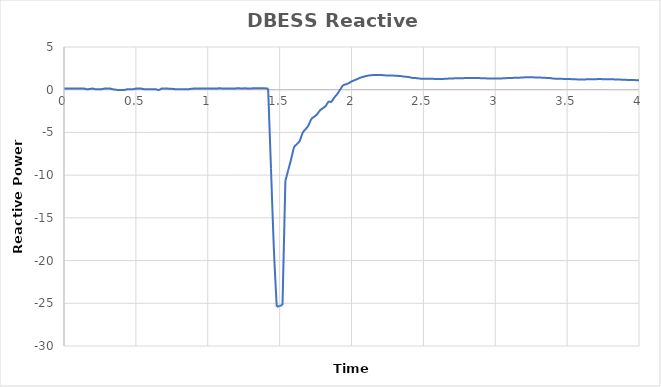
| Category | DBESS Reactive Power |
|---|---|
| 0.0 | 0.132 |
| 0.02 | 0.139 |
| 0.04 | 0.136 |
| 0.06 | 0.136 |
| 0.08 | 0.136 |
| 0.1 | 0.128 |
| 0.12 | 0.13 |
| 0.14 | 0.133 |
| 0.16 | 0.052 |
| 0.18 | 0.092 |
| 0.2 | 0.132 |
| 0.22 | 0.051 |
| 0.24 | 0.055 |
| 0.26 | 0.059 |
| 0.28 | 0.127 |
| 0.3 | 0.134 |
| 0.32 | 0.14 |
| 0.34 | 0.051 |
| 0.36 | 0.006 |
| 0.38 | -0.039 |
| 0.4 | -0.037 |
| 0.42 | -0.035 |
| 0.44 | 0.057 |
| 0.46 | 0.058 |
| 0.48 | 0.058 |
| 0.5 | 0.131 |
| 0.52 | 0.129 |
| 0.54 | 0.126 |
| 0.56 | 0.05 |
| 0.58 | 0.046 |
| 0.6 | 0.042 |
| 0.62 | 0.051 |
| 0.64 | 0.051 |
| 0.66 | -0.033 |
| 0.68 | 0.132 |
| 0.7 | 0.13 |
| 0.72 | 0.129 |
| 0.74 | 0.122 |
| 0.76 | 0.089 |
| 0.78 | 0.056 |
| 0.8 | 0.053 |
| 0.82 | 0.053 |
| 0.84 | 0.052 |
| 0.86 | 0.052 |
| 0.88 | 0.092 |
| 0.9 | 0.132 |
| 0.92 | 0.136 |
| 0.94 | 0.14 |
| 0.96 | 0.141 |
| 0.98 | 0.146 |
| 1.0 | 0.151 |
| 1.02 | 0.15 |
| 1.04 | 0.15 |
| 1.06 | 0.15 |
| 1.08 | 0.159 |
| 1.1 | 0.154 |
| 1.12 | 0.148 |
| 1.14 | 0.146 |
| 1.16 | 0.143 |
| 1.18 | 0.14 |
| 1.2 | 0.159 |
| 1.22 | 0.158 |
| 1.24 | 0.156 |
| 1.26 | 0.158 |
| 1.28 | 0.154 |
| 1.3 | 0.15 |
| 1.32 | 0.166 |
| 1.34 | 0.168 |
| 1.36 | 0.169 |
| 1.38 | 0.171 |
| 1.4 | 0.158 |
| 1.42 | 0.145 |
| 1.44 | -9.247 |
| 1.46 | -18.638 |
| 1.48 | -25.404 |
| 1.5 | -25.307 |
| 1.52 | -25.21 |
| 1.54 | -10.67 |
| 1.56 | -9.403 |
| 1.58 | -8.137 |
| 1.6 | -6.771 |
| 1.62 | -6.377 |
| 1.64 | -5.983 |
| 1.66 | -5.051 |
| 1.68 | -4.627 |
| 1.7 | -4.203 |
| 1.72 | -3.449 |
| 1.74 | -3.172 |
| 1.76 | -2.895 |
| 1.78 | -2.432 |
| 1.8 | -2.17 |
| 1.82 | -1.909 |
| 1.84 | -1.412 |
| 1.86 | -1.412 |
| 1.88 | -0.921 |
| 1.9 | -0.523 |
| 1.92 | -0.017 |
| 1.94 | 0.49 |
| 1.96 | 0.625 |
| 1.98 | 0.761 |
| 2.0 | 0.965 |
| 2.02 | 1.105 |
| 2.04 | 1.246 |
| 2.06 | 1.4 |
| 2.08 | 1.497 |
| 2.1 | 1.594 |
| 2.12 | 1.668 |
| 2.14 | 1.699 |
| 2.16 | 1.729 |
| 2.18 | 1.733 |
| 2.2 | 1.719 |
| 2.22 | 1.705 |
| 2.24 | 1.67 |
| 2.26 | 1.669 |
| 2.28 | 1.668 |
| 2.3 | 1.641 |
| 2.32 | 1.62 |
| 2.34 | 1.6 |
| 2.36 | 1.547 |
| 2.38 | 1.513 |
| 2.4 | 1.479 |
| 2.42 | 1.394 |
| 2.44 | 1.368 |
| 2.46 | 1.342 |
| 2.48 | 1.297 |
| 2.5 | 1.29 |
| 2.52 | 1.282 |
| 2.54 | 1.284 |
| 2.56 | 1.285 |
| 2.58 | 1.263 |
| 2.6 | 1.257 |
| 2.62 | 1.251 |
| 2.64 | 1.266 |
| 2.66 | 1.286 |
| 2.68 | 1.306 |
| 2.7 | 1.32 |
| 2.72 | 1.331 |
| 2.74 | 1.342 |
| 2.76 | 1.344 |
| 2.78 | 1.355 |
| 2.8 | 1.365 |
| 2.82 | 1.373 |
| 2.84 | 1.378 |
| 2.86 | 1.384 |
| 2.88 | 1.364 |
| 2.9 | 1.354 |
| 2.92 | 1.345 |
| 2.94 | 1.325 |
| 2.96 | 1.325 |
| 2.98 | 1.325 |
| 3.0 | 1.312 |
| 3.02 | 1.317 |
| 3.04 | 1.321 |
| 3.06 | 1.339 |
| 3.08 | 1.356 |
| 3.1 | 1.382 |
| 3.12 | 1.385 |
| 3.14 | 1.388 |
| 3.16 | 1.401 |
| 3.18 | 1.421 |
| 3.2 | 1.441 |
| 3.22 | 1.472 |
| 3.24 | 1.464 |
| 3.26 | 1.456 |
| 3.28 | 1.432 |
| 3.3 | 1.423 |
| 3.32 | 1.414 |
| 3.34 | 1.392 |
| 3.36 | 1.382 |
| 3.38 | 1.372 |
| 3.4 | 1.311 |
| 3.42 | 1.292 |
| 3.44 | 1.272 |
| 3.46 | 1.272 |
| 3.48 | 1.263 |
| 3.5 | 1.254 |
| 3.52 | 1.245 |
| 3.54 | 1.23 |
| 3.56 | 1.215 |
| 3.58 | 1.201 |
| 3.6 | 1.187 |
| 3.62 | 1.206 |
| 3.64 | 1.212 |
| 3.66 | 1.219 |
| 3.68 | 1.233 |
| 3.7 | 1.237 |
| 3.72 | 1.241 |
| 3.74 | 1.239 |
| 3.76 | 1.237 |
| 3.78 | 1.235 |
| 3.8 | 1.22 |
| 3.82 | 1.212 |
| 3.84 | 1.205 |
| 3.86 | 1.188 |
| 3.88 | 1.177 |
| 3.9 | 1.165 |
| 3.92 | 1.145 |
| 3.94 | 1.142 |
| 3.96 | 1.139 |
| 3.98 | 1.119 |
| 4.0 | 1.119 |